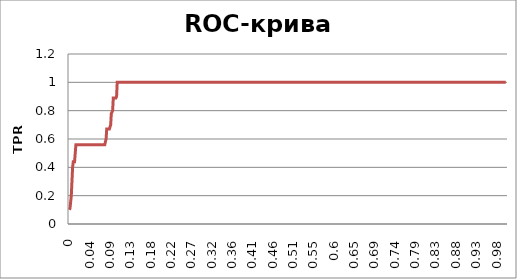
| Category | TPR |
|---|---|
| 0.0 | 0.1 |
| 0.0 | 0.11 |
| 0.0 | 0.11 |
| 0.0 | 0.2 |
| 0.0 | 0.3 |
| 0.0 | 0.4 |
| 0.0 | 0.44 |
| 0.01 | 0.44 |
| 0.01 | 0.44 |
| 0.01 | 0.5 |
| 0.01 | 0.56 |
| 0.01 | 0.56 |
| 0.01 | 0.56 |
| 0.01 | 0.56 |
| 0.02 | 0.56 |
| 0.02 | 0.56 |
| 0.02 | 0.56 |
| 0.02 | 0.56 |
| 0.02 | 0.56 |
| 0.02 | 0.56 |
| 0.02 | 0.56 |
| 0.03 | 0.56 |
| 0.03 | 0.56 |
| 0.03 | 0.56 |
| 0.03 | 0.56 |
| 0.03 | 0.56 |
| 0.03 | 0.56 |
| 0.03 | 0.56 |
| 0.04 | 0.56 |
| 0.04 | 0.56 |
| 0.04 | 0.56 |
| 0.04 | 0.56 |
| 0.04 | 0.56 |
| 0.04 | 0.56 |
| 0.05 | 0.56 |
| 0.05 | 0.56 |
| 0.05 | 0.56 |
| 0.05 | 0.56 |
| 0.05 | 0.56 |
| 0.05 | 0.56 |
| 0.05 | 0.56 |
| 0.06 | 0.56 |
| 0.06 | 0.56 |
| 0.06 | 0.56 |
| 0.06 | 0.56 |
| 0.06 | 0.56 |
| 0.06 | 0.56 |
| 0.07 | 0.56 |
| 0.07 | 0.56 |
| 0.07 | 0.56 |
| 0.07 | 0.56 |
| 0.07 | 0.56 |
| 0.07 | 0.56 |
| 0.07 | 0.56 |
| 0.08 | 0.56 |
| 0.08 | 0.56 |
| 0.08 | 0.6 |
| 0.08 | 0.67 |
| 0.08 | 0.67 |
| 0.08 | 0.67 |
| 0.08 | 0.67 |
| 0.08 | 0.67 |
| 0.09 | 0.67 |
| 0.09 | 0.7 |
| 0.09 | 0.78 |
| 0.09 | 0.78 |
| 0.09 | 0.8 |
| 0.09 | 0.89 |
| 0.09 | 0.89 |
| 0.09 | 0.89 |
| 0.1 | 0.89 |
| 0.1 | 0.89 |
| 0.1 | 0.9 |
| 0.1 | 1 |
| 0.1 | 1 |
| 0.1 | 1 |
| 0.1 | 1 |
| 0.1 | 1 |
| 0.11 | 1 |
| 0.11 | 1 |
| 0.11 | 1 |
| 0.11 | 1 |
| 0.11 | 1 |
| 0.11 | 1 |
| 0.12 | 1 |
| 0.12 | 1 |
| 0.12 | 1 |
| 0.12 | 1 |
| 0.12 | 1 |
| 0.12 | 1 |
| 0.12 | 1 |
| 0.13 | 1 |
| 0.13 | 1 |
| 0.13 | 1 |
| 0.13 | 1 |
| 0.13 | 1 |
| 0.13 | 1 |
| 0.14 | 1 |
| 0.14 | 1 |
| 0.14 | 1 |
| 0.14 | 1 |
| 0.14 | 1 |
| 0.14 | 1 |
| 0.14 | 1 |
| 0.15 | 1 |
| 0.15 | 1 |
| 0.15 | 1 |
| 0.15 | 1 |
| 0.15 | 1 |
| 0.15 | 1 |
| 0.15 | 1 |
| 0.16 | 1 |
| 0.16 | 1 |
| 0.16 | 1 |
| 0.16 | 1 |
| 0.16 | 1 |
| 0.16 | 1 |
| 0.17 | 1 |
| 0.17 | 1 |
| 0.17 | 1 |
| 0.17 | 1 |
| 0.17 | 1 |
| 0.17 | 1 |
| 0.17 | 1 |
| 0.18 | 1 |
| 0.18 | 1 |
| 0.18 | 1 |
| 0.18 | 1 |
| 0.18 | 1 |
| 0.18 | 1 |
| 0.19 | 1 |
| 0.19 | 1 |
| 0.19 | 1 |
| 0.19 | 1 |
| 0.19 | 1 |
| 0.19 | 1 |
| 0.19 | 1 |
| 0.2 | 1 |
| 0.2 | 1 |
| 0.2 | 1 |
| 0.2 | 1 |
| 0.2 | 1 |
| 0.2 | 1 |
| 0.2 | 1 |
| 0.21 | 1 |
| 0.21 | 1 |
| 0.21 | 1 |
| 0.21 | 1 |
| 0.21 | 1 |
| 0.21 | 1 |
| 0.22 | 1 |
| 0.22 | 1 |
| 0.22 | 1 |
| 0.22 | 1 |
| 0.22 | 1 |
| 0.22 | 1 |
| 0.22 | 1 |
| 0.23 | 1 |
| 0.23 | 1 |
| 0.23 | 1 |
| 0.23 | 1 |
| 0.23 | 1 |
| 0.23 | 1 |
| 0.24 | 1 |
| 0.24 | 1 |
| 0.24 | 1 |
| 0.24 | 1 |
| 0.24 | 1 |
| 0.24 | 1 |
| 0.24 | 1 |
| 0.25 | 1 |
| 0.25 | 1 |
| 0.25 | 1 |
| 0.25 | 1 |
| 0.25 | 1 |
| 0.25 | 1 |
| 0.25 | 1 |
| 0.26 | 1 |
| 0.26 | 1 |
| 0.26 | 1 |
| 0.26 | 1 |
| 0.26 | 1 |
| 0.26 | 1 |
| 0.27 | 1 |
| 0.27 | 1 |
| 0.27 | 1 |
| 0.27 | 1 |
| 0.27 | 1 |
| 0.27 | 1 |
| 0.27 | 1 |
| 0.28 | 1 |
| 0.28 | 1 |
| 0.28 | 1 |
| 0.28 | 1 |
| 0.28 | 1 |
| 0.28 | 1 |
| 0.29 | 1 |
| 0.29 | 1 |
| 0.29 | 1 |
| 0.29 | 1 |
| 0.29 | 1 |
| 0.29 | 1 |
| 0.29 | 1 |
| 0.3 | 1 |
| 0.3 | 1 |
| 0.3 | 1 |
| 0.3 | 1 |
| 0.3 | 1 |
| 0.3 | 1 |
| 0.31 | 1 |
| 0.31 | 1 |
| 0.31 | 1 |
| 0.31 | 1 |
| 0.31 | 1 |
| 0.31 | 1 |
| 0.31 | 1 |
| 0.32 | 1 |
| 0.32 | 1 |
| 0.32 | 1 |
| 0.32 | 1 |
| 0.32 | 1 |
| 0.32 | 1 |
| 0.32 | 1 |
| 0.33 | 1 |
| 0.33 | 1 |
| 0.33 | 1 |
| 0.33 | 1 |
| 0.33 | 1 |
| 0.33 | 1 |
| 0.34 | 1 |
| 0.34 | 1 |
| 0.34 | 1 |
| 0.34 | 1 |
| 0.34 | 1 |
| 0.34 | 1 |
| 0.34 | 1 |
| 0.35 | 1 |
| 0.35 | 1 |
| 0.35 | 1 |
| 0.35 | 1 |
| 0.35 | 1 |
| 0.35 | 1 |
| 0.36 | 1 |
| 0.36 | 1 |
| 0.36 | 1 |
| 0.36 | 1 |
| 0.36 | 1 |
| 0.36 | 1 |
| 0.36 | 1 |
| 0.37 | 1 |
| 0.37 | 1 |
| 0.37 | 1 |
| 0.37 | 1 |
| 0.37 | 1 |
| 0.37 | 1 |
| 0.37 | 1 |
| 0.38 | 1 |
| 0.38 | 1 |
| 0.38 | 1 |
| 0.38 | 1 |
| 0.38 | 1 |
| 0.38 | 1 |
| 0.39 | 1 |
| 0.39 | 1 |
| 0.39 | 1 |
| 0.39 | 1 |
| 0.39 | 1 |
| 0.39 | 1 |
| 0.39 | 1 |
| 0.4 | 1 |
| 0.4 | 1 |
| 0.4 | 1 |
| 0.4 | 1 |
| 0.4 | 1 |
| 0.4 | 1 |
| 0.41 | 1 |
| 0.41 | 1 |
| 0.41 | 1 |
| 0.41 | 1 |
| 0.41 | 1 |
| 0.41 | 1 |
| 0.41 | 1 |
| 0.42 | 1 |
| 0.42 | 1 |
| 0.42 | 1 |
| 0.42 | 1 |
| 0.42 | 1 |
| 0.42 | 1 |
| 0.42 | 1 |
| 0.43 | 1 |
| 0.43 | 1 |
| 0.43 | 1 |
| 0.43 | 1 |
| 0.43 | 1 |
| 0.43 | 1 |
| 0.44 | 1 |
| 0.44 | 1 |
| 0.44 | 1 |
| 0.44 | 1 |
| 0.44 | 1 |
| 0.44 | 1 |
| 0.44 | 1 |
| 0.45 | 1 |
| 0.45 | 1 |
| 0.45 | 1 |
| 0.45 | 1 |
| 0.45 | 1 |
| 0.45 | 1 |
| 0.46 | 1 |
| 0.46 | 1 |
| 0.46 | 1 |
| 0.46 | 1 |
| 0.46 | 1 |
| 0.46 | 1 |
| 0.46 | 1 |
| 0.47 | 1 |
| 0.47 | 1 |
| 0.47 | 1 |
| 0.47 | 1 |
| 0.47 | 1 |
| 0.47 | 1 |
| 0.47 | 1 |
| 0.48 | 1 |
| 0.48 | 1 |
| 0.48 | 1 |
| 0.48 | 1 |
| 0.48 | 1 |
| 0.48 | 1 |
| 0.49 | 1 |
| 0.49 | 1 |
| 0.49 | 1 |
| 0.49 | 1 |
| 0.49 | 1 |
| 0.49 | 1 |
| 0.49 | 1 |
| 0.5 | 1 |
| 0.5 | 1 |
| 0.5 | 1 |
| 0.5 | 1 |
| 0.5 | 1 |
| 0.5 | 1 |
| 0.51 | 1 |
| 0.51 | 1 |
| 0.51 | 1 |
| 0.51 | 1 |
| 0.51 | 1 |
| 0.51 | 1 |
| 0.51 | 1 |
| 0.52 | 1 |
| 0.52 | 1 |
| 0.52 | 1 |
| 0.52 | 1 |
| 0.52 | 1 |
| 0.52 | 1 |
| 0.53 | 1 |
| 0.53 | 1 |
| 0.53 | 1 |
| 0.53 | 1 |
| 0.53 | 1 |
| 0.53 | 1 |
| 0.53 | 1 |
| 0.54 | 1 |
| 0.54 | 1 |
| 0.54 | 1 |
| 0.54 | 1 |
| 0.54 | 1 |
| 0.54 | 1 |
| 0.54 | 1 |
| 0.55 | 1 |
| 0.55 | 1 |
| 0.55 | 1 |
| 0.55 | 1 |
| 0.55 | 1 |
| 0.55 | 1 |
| 0.56 | 1 |
| 0.56 | 1 |
| 0.56 | 1 |
| 0.56 | 1 |
| 0.56 | 1 |
| 0.56 | 1 |
| 0.56 | 1 |
| 0.57 | 1 |
| 0.57 | 1 |
| 0.57 | 1 |
| 0.57 | 1 |
| 0.57 | 1 |
| 0.57 | 1 |
| 0.58 | 1 |
| 0.58 | 1 |
| 0.58 | 1 |
| 0.58 | 1 |
| 0.58 | 1 |
| 0.58 | 1 |
| 0.58 | 1 |
| 0.59 | 1 |
| 0.59 | 1 |
| 0.59 | 1 |
| 0.59 | 1 |
| 0.59 | 1 |
| 0.59 | 1 |
| 0.59 | 1 |
| 0.6 | 1 |
| 0.6 | 1 |
| 0.6 | 1 |
| 0.6 | 1 |
| 0.6 | 1 |
| 0.6 | 1 |
| 0.61 | 1 |
| 0.61 | 1 |
| 0.61 | 1 |
| 0.61 | 1 |
| 0.61 | 1 |
| 0.61 | 1 |
| 0.61 | 1 |
| 0.62 | 1 |
| 0.62 | 1 |
| 0.62 | 1 |
| 0.62 | 1 |
| 0.62 | 1 |
| 0.62 | 1 |
| 0.63 | 1 |
| 0.63 | 1 |
| 0.63 | 1 |
| 0.63 | 1 |
| 0.63 | 1 |
| 0.63 | 1 |
| 0.63 | 1 |
| 0.64 | 1 |
| 0.64 | 1 |
| 0.64 | 1 |
| 0.64 | 1 |
| 0.64 | 1 |
| 0.64 | 1 |
| 0.64 | 1 |
| 0.65 | 1 |
| 0.65 | 1 |
| 0.65 | 1 |
| 0.65 | 1 |
| 0.65 | 1 |
| 0.65 | 1 |
| 0.66 | 1 |
| 0.66 | 1 |
| 0.66 | 1 |
| 0.66 | 1 |
| 0.66 | 1 |
| 0.66 | 1 |
| 0.66 | 1 |
| 0.67 | 1 |
| 0.67 | 1 |
| 0.67 | 1 |
| 0.67 | 1 |
| 0.67 | 1 |
| 0.67 | 1 |
| 0.68 | 1 |
| 0.68 | 1 |
| 0.68 | 1 |
| 0.68 | 1 |
| 0.68 | 1 |
| 0.68 | 1 |
| 0.68 | 1 |
| 0.69 | 1 |
| 0.69 | 1 |
| 0.69 | 1 |
| 0.69 | 1 |
| 0.69 | 1 |
| 0.69 | 1 |
| 0.69 | 1 |
| 0.7 | 1 |
| 0.7 | 1 |
| 0.7 | 1 |
| 0.7 | 1 |
| 0.7 | 1 |
| 0.7 | 1 |
| 0.71 | 1 |
| 0.71 | 1 |
| 0.71 | 1 |
| 0.71 | 1 |
| 0.71 | 1 |
| 0.71 | 1 |
| 0.71 | 1 |
| 0.72 | 1 |
| 0.72 | 1 |
| 0.72 | 1 |
| 0.72 | 1 |
| 0.72 | 1 |
| 0.72 | 1 |
| 0.73 | 1 |
| 0.73 | 1 |
| 0.73 | 1 |
| 0.73 | 1 |
| 0.73 | 1 |
| 0.73 | 1 |
| 0.73 | 1 |
| 0.74 | 1 |
| 0.74 | 1 |
| 0.74 | 1 |
| 0.74 | 1 |
| 0.74 | 1 |
| 0.74 | 1 |
| 0.75 | 1 |
| 0.75 | 1 |
| 0.75 | 1 |
| 0.75 | 1 |
| 0.75 | 1 |
| 0.75 | 1 |
| 0.75 | 1 |
| 0.76 | 1 |
| 0.76 | 1 |
| 0.76 | 1 |
| 0.76 | 1 |
| 0.76 | 1 |
| 0.76 | 1 |
| 0.76 | 1 |
| 0.77 | 1 |
| 0.77 | 1 |
| 0.77 | 1 |
| 0.77 | 1 |
| 0.77 | 1 |
| 0.77 | 1 |
| 0.78 | 1 |
| 0.78 | 1 |
| 0.78 | 1 |
| 0.78 | 1 |
| 0.78 | 1 |
| 0.78 | 1 |
| 0.78 | 1 |
| 0.79 | 1 |
| 0.79 | 1 |
| 0.79 | 1 |
| 0.79 | 1 |
| 0.79 | 1 |
| 0.79 | 1 |
| 0.8 | 1 |
| 0.8 | 1 |
| 0.8 | 1 |
| 0.8 | 1 |
| 0.8 | 1 |
| 0.8 | 1 |
| 0.8 | 1 |
| 0.81 | 1 |
| 0.81 | 1 |
| 0.81 | 1 |
| 0.81 | 1 |
| 0.81 | 1 |
| 0.81 | 1 |
| 0.81 | 1 |
| 0.82 | 1 |
| 0.82 | 1 |
| 0.82 | 1 |
| 0.82 | 1 |
| 0.82 | 1 |
| 0.82 | 1 |
| 0.83 | 1 |
| 0.83 | 1 |
| 0.83 | 1 |
| 0.83 | 1 |
| 0.83 | 1 |
| 0.83 | 1 |
| 0.83 | 1 |
| 0.84 | 1 |
| 0.84 | 1 |
| 0.84 | 1 |
| 0.84 | 1 |
| 0.84 | 1 |
| 0.84 | 1 |
| 0.85 | 1 |
| 0.85 | 1 |
| 0.85 | 1 |
| 0.85 | 1 |
| 0.85 | 1 |
| 0.85 | 1 |
| 0.85 | 1 |
| 0.86 | 1 |
| 0.86 | 1 |
| 0.86 | 1 |
| 0.86 | 1 |
| 0.86 | 1 |
| 0.86 | 1 |
| 0.86 | 1 |
| 0.87 | 1 |
| 0.87 | 1 |
| 0.87 | 1 |
| 0.87 | 1 |
| 0.87 | 1 |
| 0.87 | 1 |
| 0.88 | 1 |
| 0.88 | 1 |
| 0.88 | 1 |
| 0.88 | 1 |
| 0.88 | 1 |
| 0.88 | 1 |
| 0.88 | 1 |
| 0.89 | 1 |
| 0.89 | 1 |
| 0.89 | 1 |
| 0.89 | 1 |
| 0.89 | 1 |
| 0.89 | 1 |
| 0.9 | 1 |
| 0.9 | 1 |
| 0.9 | 1 |
| 0.9 | 1 |
| 0.9 | 1 |
| 0.9 | 1 |
| 0.9 | 1 |
| 0.91 | 1 |
| 0.91 | 1 |
| 0.91 | 1 |
| 0.91 | 1 |
| 0.91 | 1 |
| 0.91 | 1 |
| 0.92 | 1 |
| 0.92 | 1 |
| 0.92 | 1 |
| 0.92 | 1 |
| 0.92 | 1 |
| 0.92 | 1 |
| 0.92 | 1 |
| 0.93 | 1 |
| 0.93 | 1 |
| 0.93 | 1 |
| 0.93 | 1 |
| 0.93 | 1 |
| 0.93 | 1 |
| 0.93 | 1 |
| 0.94 | 1 |
| 0.94 | 1 |
| 0.94 | 1 |
| 0.94 | 1 |
| 0.94 | 1 |
| 0.94 | 1 |
| 0.95 | 1 |
| 0.95 | 1 |
| 0.95 | 1 |
| 0.95 | 1 |
| 0.95 | 1 |
| 0.95 | 1 |
| 0.95 | 1 |
| 0.96 | 1 |
| 0.96 | 1 |
| 0.96 | 1 |
| 0.96 | 1 |
| 0.96 | 1 |
| 0.96 | 1 |
| 0.97 | 1 |
| 0.97 | 1 |
| 0.97 | 1 |
| 0.97 | 1 |
| 0.97 | 1 |
| 0.97 | 1 |
| 0.97 | 1 |
| 0.98 | 1 |
| 0.98 | 1 |
| 0.98 | 1 |
| 0.98 | 1 |
| 0.98 | 1 |
| 0.98 | 1 |
| 0.98 | 1 |
| 0.99 | 1 |
| 0.99 | 1 |
| 0.99 | 1 |
| 0.99 | 1 |
| 0.99 | 1 |
| 0.99 | 1 |
| 1.0 | 1 |
| 1.0 | 1 |
| 1.0 | 1 |